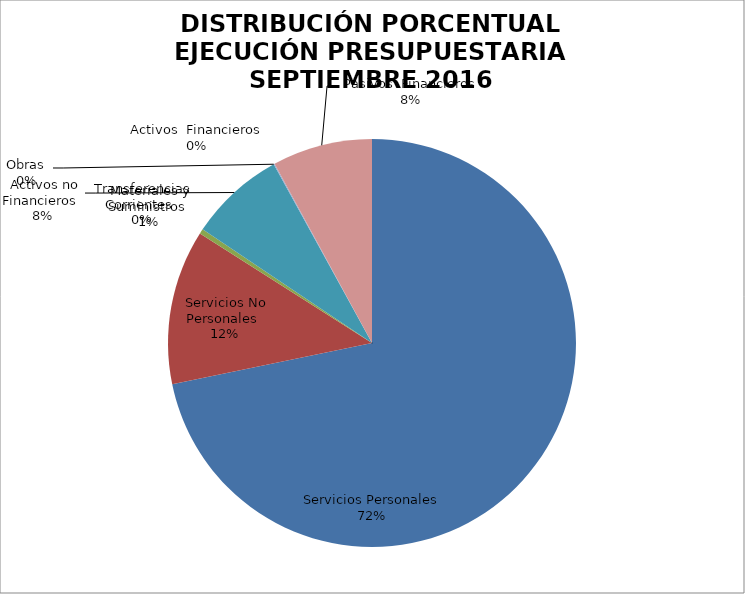
| Category | Series 0 | Series 1 |
|---|---|---|
| Servicios Personales | 21203812.49 | 0.853 |
| Servicios No Personales | 3623273.41 | 0.146 |
| Materiales y Suministros | 112517.9 | 0.005 |
| Transferencias Corrientes | 0 | 0 |
| Activos no Financieros | 2244306.39 | 0.09 |
| Obras | 0 | 0 |
| Activos  Financieros | 21700 | 0.001 |
| Pasivos  Financieros | -2342067.06 | -0.094 |